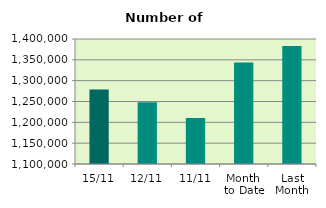
| Category | Series 0 |
|---|---|
| 15/11 | 1278912 |
| 12/11 | 1248346 |
| 11/11 | 1210680 |
| Month 
to Date | 1343462.182 |
| Last
Month | 1383348.571 |